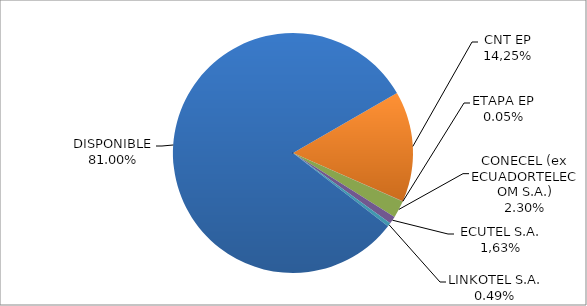
| Category | CODIGO DE AREA 4 |
|---|---|
| CORPORACIÓN NACIONAL TELECOMUNICACIONES CNT EP | 0.149 |
| ETAPA EP | 0.001 |
| CONECEL (ex ECUADORTELECOM S.A.) | 0.023 |
| SETEL S.A. | 0.01 |
| LINKOTEL S.A. | 0.005 |
| DISPONIBLE | 0.81 |